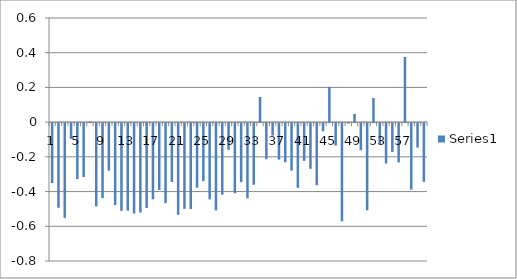
| Category | Series 0 |
|---|---|
| 0 | -0.345 |
| 1 | -0.488 |
| 2 | -0.546 |
| 3 | -0.091 |
| 4 | -0.322 |
| 5 | -0.31 |
| 6 | 0.004 |
| 7 | -0.48 |
| 8 | -0.432 |
| 9 | -0.274 |
| 10 | -0.472 |
| 11 | -0.505 |
| 12 | -0.504 |
| 13 | -0.521 |
| 14 | -0.515 |
| 15 | -0.489 |
| 16 | -0.438 |
| 17 | -0.385 |
| 18 | -0.461 |
| 19 | -0.339 |
| 20 | -0.528 |
| 21 | -0.494 |
| 22 | -0.495 |
| 23 | -0.372 |
| 24 | -0.334 |
| 25 | -0.439 |
| 26 | -0.503 |
| 27 | -0.412 |
| 28 | -0.153 |
| 29 | -0.404 |
| 30 | -0.34 |
| 31 | -0.433 |
| 32 | -0.355 |
| 33 | 0.145 |
| 34 | -0.208 |
| 35 | -0.071 |
| 36 | -0.21 |
| 37 | -0.226 |
| 38 | -0.273 |
| 39 | -0.372 |
| 40 | -0.217 |
| 41 | -0.263 |
| 42 | -0.358 |
| 43 | -0.047 |
| 44 | 0.204 |
| 45 | -0.129 |
| 46 | -0.565 |
| 47 | -0.003 |
| 48 | 0.047 |
| 49 | -0.156 |
| 50 | -0.502 |
| 51 | 0.139 |
| 52 | -0.12 |
| 53 | -0.232 |
| 54 | -0.166 |
| 55 | -0.227 |
| 56 | 0.375 |
| 57 | -0.383 |
| 58 | -0.141 |
| 59 | -0.338 |